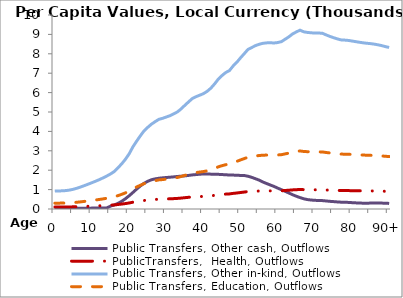
| Category | Public Transfers, Other cash, Outflows | PublicTransfers,  Health, Outflows | Public Transfers, Other in-kind, Outflows | Public Transfers, Education, Outflows |
|---|---|---|---|---|
| 0 | 30.934 | 100.77 | 923.572 | 299.829 |
|  | 31.15 | 101.473 | 930.014 | 301.92 |
| 2 | 31.366 | 102.176 | 936.456 | 304.012 |
| 3 | 31.829 | 103.687 | 950.305 | 308.507 |
| 4 | 32.713 | 106.564 | 976.679 | 317.07 |
| 5 | 34.111 | 111.12 | 1018.432 | 330.624 |
| 6 | 36.009 | 117.304 | 1075.105 | 349.022 |
| 7 | 38.171 | 124.344 | 1139.635 | 369.971 |
| 8 | 40.492 | 131.905 | 1208.929 | 392.467 |
| 9 | 42.935 | 139.863 | 1281.87 | 416.147 |
| 10 | 45.503 | 148.23 | 1358.546 | 441.039 |
| 11 | 48.046 | 156.515 | 1434.48 | 465.69 |
| 12 | 50.789 | 165.448 | 1516.356 | 492.27 |
| 13 | 53.785 | 175.21 | 1605.826 | 521.316 |
| 14 | 57.016 | 185.735 | 1702.291 | 552.632 |
| 15 | 148.792 | 197.179 | 1807.179 | 586.683 |
| 16 | 207.953 | 210.99 | 1933.754 | 627.775 |
| 17 | 290.344 | 232.149 | 2127.683 | 690.732 |
| 18 | 396.632 | 253.887 | 2326.91 | 755.409 |
| 19 | 528.426 | 279.858 | 2564.937 | 832.682 |
| 20 | 680.745 | 310.053 | 2841.681 | 922.524 |
| 21 | 849.839 | 348.993 | 3198.571 | 1038.385 |
| 22 | 1022.633 | 380.881 | 3490.827 | 1133.263 |
| 23 | 1183.042 | 411.003 | 3766.903 | 1222.889 |
| 24 | 1321.294 | 438.98 | 4023.313 | 1306.13 |
| 25 | 1427.41 | 459.019 | 4206.977 | 1365.755 |
| 26 | 1506.595 | 477.103 | 4372.719 | 1419.561 |
| 27 | 1553.95 | 491.173 | 4501.675 | 1461.425 |
| 28 | 1585.437 | 504.255 | 4621.573 | 1500.349 |
| 29 | 1605.713 | 509.944 | 4673.715 | 1517.277 |
| 30 | 1624.154 | 517.438 | 4742.396 | 1539.573 |
| 31 | 1639.136 | 524.532 | 4807.414 | 1560.681 |
| 32 | 1657.023 | 534.962 | 4903.005 | 1591.713 |
| 33 | 1677.458 | 546.146 | 5005.509 | 1624.99 |
| 34 | 1691.767 | 563.081 | 5160.725 | 1675.38 |
| 35 | 1708.05 | 583.219 | 5345.29 | 1735.297 |
| 36 | 1731.288 | 602.357 | 5520.691 | 1792.239 |
| 37 | 1757.724 | 621.012 | 5691.671 | 1847.746 |
| 38 | 1774.06 | 631.497 | 5787.764 | 1878.942 |
| 39 | 1792.981 | 640.076 | 5866.394 | 1904.468 |
| 40 | 1805.101 | 648.689 | 5945.329 | 1930.094 |
| 41 | 1803.052 | 661.716 | 6064.724 | 1968.854 |
| 42 | 1797.069 | 679.591 | 6228.548 | 2022.038 |
| 43 | 1792.472 | 703.338 | 6446.2 | 2092.697 |
| 44 | 1786.64 | 730.142 | 6691.862 | 2172.449 |
| 45 | 1776.204 | 750.399 | 6877.52 | 2232.721 |
| 46 | 1763.673 | 767.502 | 7034.268 | 2283.607 |
| 47 | 1753.304 | 778.577 | 7135.772 | 2316.56 |
| 48 | 1748.127 | 804.373 | 7372.195 | 2393.312 |
| 49 | 1740.109 | 825.292 | 7563.922 | 2455.554 |
| 50 | 1729.783 | 850.431 | 7794.329 | 2530.354 |
| 51 | 1725.877 | 873.785 | 8008.365 | 2599.839 |
| 52 | 1688.895 | 897.717 | 8227.708 | 2671.046 |
| 53 | 1632.47 | 908.029 | 8322.221 | 2701.729 |
| 54 | 1560.465 | 918.831 | 8421.224 | 2733.869 |
| 55 | 1489.323 | 926.38 | 8490.413 | 2756.331 |
| 56 | 1392.683 | 931.858 | 8540.618 | 2772.63 |
| 57 | 1313.814 | 934.26 | 8562.631 | 2779.776 |
| 58 | 1237.364 | 935.037 | 8569.749 | 2782.086 |
| 59 | 1163.808 | 933.68 | 8557.318 | 2778.051 |
| 60 | 1075.733 | 936.157 | 8580.022 | 2785.421 |
| 61 | 994.978 | 941.294 | 8627.098 | 2800.704 |
| 62 | 910.792 | 954.75 | 8750.424 | 2840.741 |
| 63 | 825.825 | 968.276 | 8874.396 | 2880.987 |
| 64 | 735.945 | 984.61 | 9024.096 | 2929.586 |
| 65 | 658.76 | 995.75 | 9126.199 | 2962.733 |
| 66 | 588.262 | 1005.712 | 9217.502 | 2992.373 |
| 67 | 527.509 | 996.606 | 9134.038 | 2965.277 |
| 68 | 485.333 | 993.081 | 9101.739 | 2954.792 |
| 69 | 463.08 | 991.015 | 9082.797 | 2948.643 |
| 70 | 446.802 | 989.506 | 9068.973 | 2944.155 |
| 71 | 439.606 | 989.553 | 9069.405 | 2944.295 |
| 72 | 432.906 | 988.54 | 9060.115 | 2941.279 |
| 73 | 415.092 | 979.487 | 8977.144 | 2914.343 |
| 74 | 395.598 | 971.073 | 8900.028 | 2889.308 |
| 75 | 381.349 | 963.685 | 8832.317 | 2867.327 |
| 76 | 365.703 | 957.078 | 8771.764 | 2847.669 |
| 77 | 352.584 | 951.272 | 8718.546 | 2830.392 |
| 78 | 346.691 | 949.993 | 8706.827 | 2826.588 |
| 79 | 340.409 | 948.058 | 8689.095 | 2820.831 |
| 80 | 327.296 | 944.862 | 8659.802 | 2811.321 |
| 81 | 316.308 | 941.32 | 8627.334 | 2800.781 |
| 82 | 305.97 | 937.856 | 8595.585 | 2790.474 |
| 83 | 300.971 | 934.586 | 8565.615 | 2780.745 |
| 84 | 299.628 | 932.131 | 8543.118 | 2773.441 |
| 85 | 304.293 | 930.043 | 8523.979 | 2767.228 |
| 86 | 308.398 | 927.119 | 8497.187 | 2758.53 |
| 87 | 309.934 | 923.457 | 8463.618 | 2747.632 |
| 88 | 304.273 | 918.869 | 8421.568 | 2733.981 |
| 89 | 296.143 | 913.254 | 8370.111 | 2717.276 |
| 90+ | 288.262 | 908.45 | 8326.079 | 2702.982 |